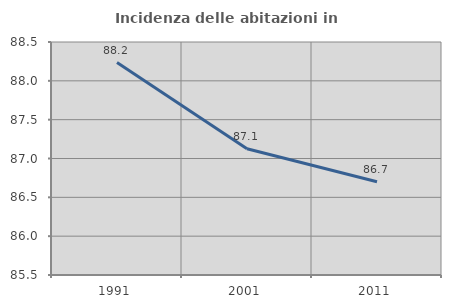
| Category | Incidenza delle abitazioni in proprietà  |
|---|---|
| 1991.0 | 88.235 |
| 2001.0 | 87.125 |
| 2011.0 | 86.7 |